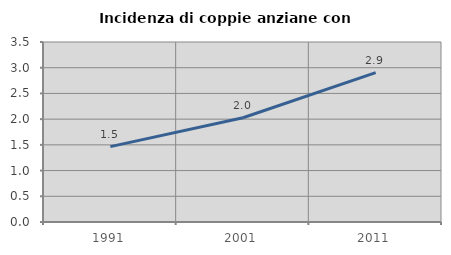
| Category | Incidenza di coppie anziane con figli |
|---|---|
| 1991.0 | 1.466 |
| 2001.0 | 2.028 |
| 2011.0 | 2.905 |